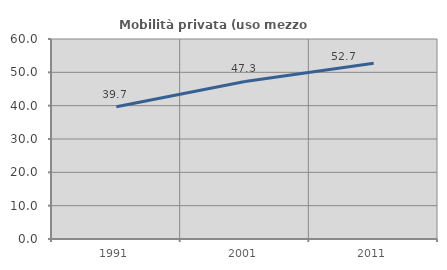
| Category | Mobilità privata (uso mezzo privato) |
|---|---|
| 1991.0 | 39.655 |
| 2001.0 | 47.273 |
| 2011.0 | 52.717 |